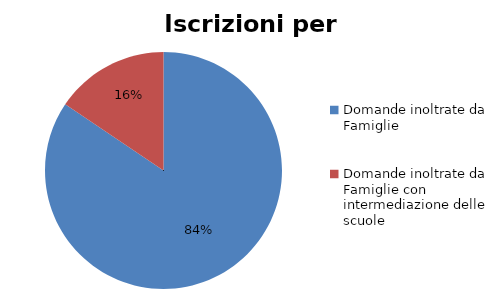
| Category | Series 0 |
|---|---|
| Domande inoltrate da Famiglie | 93336 |
| Domande inoltrate da Famiglie con intermediazione delle scuole | 17208 |